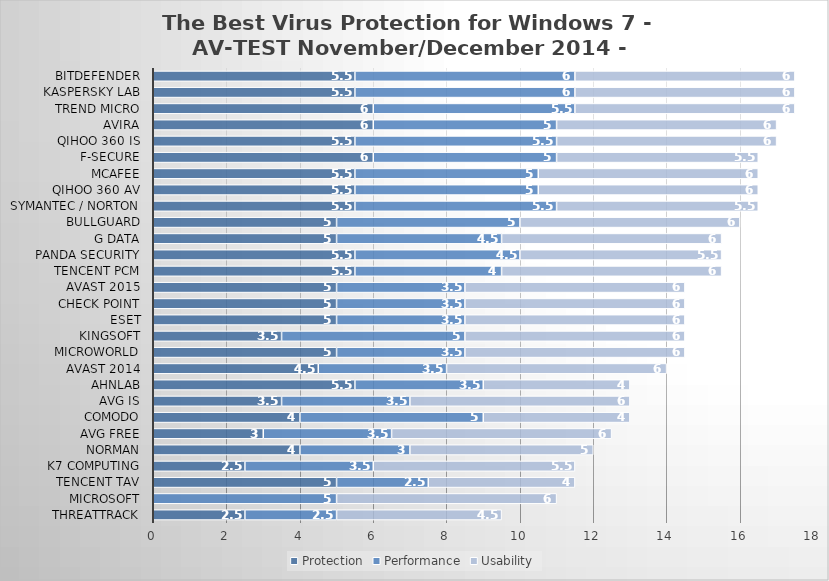
| Category | Protection | Performance | Usability |
|---|---|---|---|
| ThreatTrack | 2.5 | 2.5 | 4.5 |
| Microsoft | 0 | 5 | 6 |
| Tencent TAV | 5 | 2.5 | 4 |
| K7 Computing | 2.5 | 3.5 | 5.5 |
| Norman | 4 | 3 | 5 |
| AVG Free | 3 | 3.5 | 6 |
| Comodo | 4 | 5 | 4 |
| AVG IS | 3.5 | 3.5 | 6 |
| AhnLab | 5.5 | 3.5 | 4 |
| Avast 2014 | 4.5 | 3.5 | 6 |
| Microworld | 5 | 3.5 | 6 |
| Kingsoft | 3.5 | 5 | 6 |
| ESET | 5 | 3.5 | 6 |
| Check Point | 5 | 3.5 | 6 |
| Avast 2015 | 5 | 3.5 | 6 |
| Tencent PCM | 5.5 | 4 | 6 |
| Panda Security | 5.5 | 4.5 | 5.5 |
| G Data | 5 | 4.5 | 6 |
| BullGuard | 5 | 5 | 6 |
| Symantec / Norton | 5.5 | 5.5 | 5.5 |
| Qihoo 360 AV | 5.5 | 5 | 6 |
| McAfee | 5.5 | 5 | 6 |
| F-Secure | 6 | 5 | 5.5 |
| Qihoo 360 IS | 5.5 | 5.5 | 6 |
| Avira | 6 | 5 | 6 |
| Trend Micro | 6 | 5.5 | 6 |
| Kaspersky Lab | 5.5 | 6 | 6 |
| Bitdefender | 5.5 | 6 | 6 |